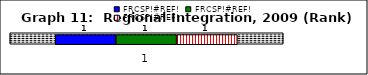
| Category | FRCSP!#REF! |
|---|---|
| 0 | 1 |